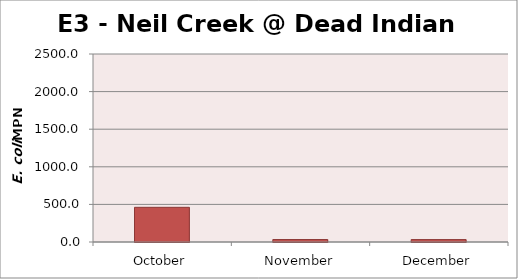
| Category | Series 0 |
|---|---|
| October | 461.1 |
| November | 32.7 |
| December | 32 |